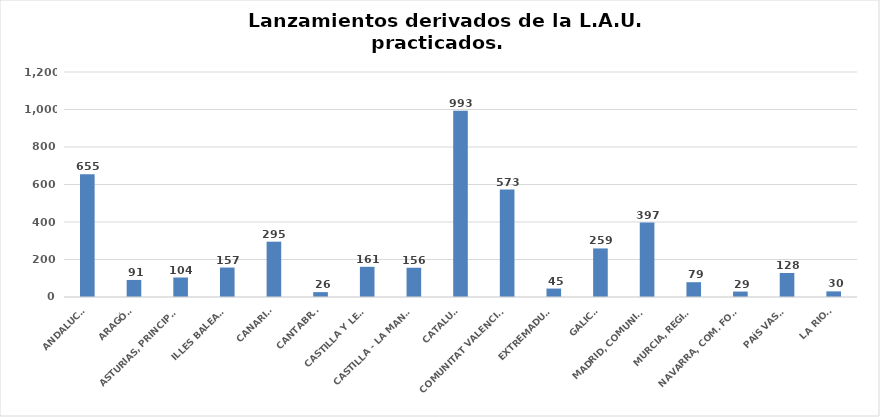
| Category | Series 0 |
|---|---|
| ANDALUCÍA | 655 |
| ARAGÓN | 91 |
| ASTURIAS, PRINCIPADO | 104 |
| ILLES BALEARS | 157 |
| CANARIAS | 295 |
| CANTABRIA | 26 |
| CASTILLA Y LEÓN | 161 |
| CASTILLA - LA MANCHA | 156 |
| CATALUÑA | 993 |
| COMUNITAT VALENCIANA | 573 |
| EXTREMADURA | 45 |
| GALICIA | 259 |
| MADRID, COMUNIDAD | 397 |
| MURCIA, REGIÓN | 79 |
| NAVARRA, COM. FORAL | 29 |
| PAÍS VASCO | 128 |
| LA RIOJA | 30 |